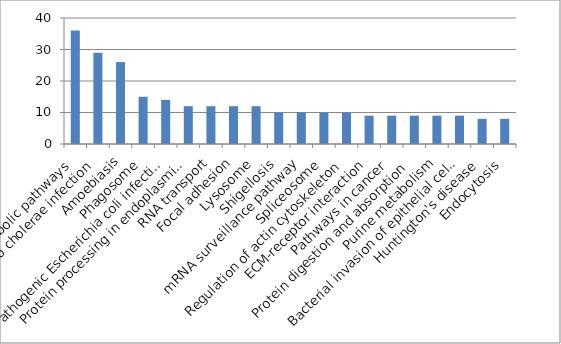
| Category | Series 0 |
|---|---|
| Metabolic pathways | 36 |
| Vibrio cholerae infection | 29 |
| Amoebiasis | 26 |
| Phagosome | 15 |
| Pathogenic Escherichia coli infection | 14 |
| Protein processing in endoplasmic reticulum | 12 |
| RNA transport | 12 |
| Focal adhesion | 12 |
| Lysosome | 12 |
| Shigellosis | 10 |
| mRNA surveillance pathway | 10 |
| Spliceosome | 10 |
| Regulation of actin cytoskeleton | 10 |
| ECM-receptor interaction | 9 |
| Pathways in cancer | 9 |
| Protein digestion and absorption | 9 |
| Purine metabolism | 9 |
| Bacterial invasion of epithelial cells | 9 |
| Huntington's disease | 8 |
| Endocytosis | 8 |